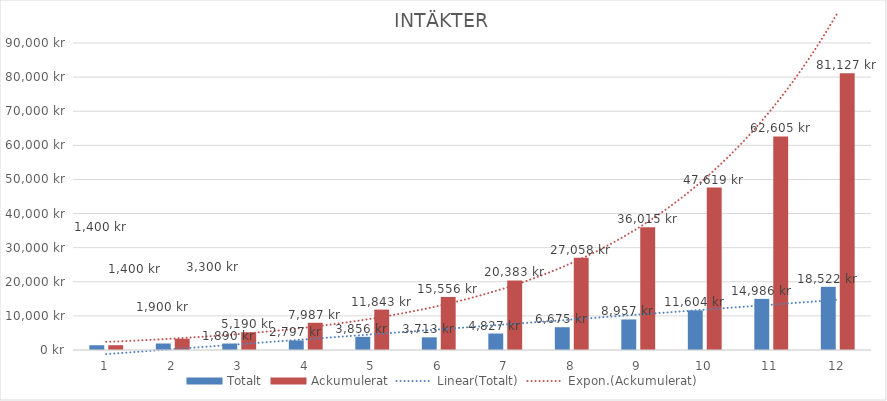
| Category | Totalt | Ackumulerat |
|---|---|---|
| 0 | 1400 | 1400 |
| 1 | 1900 | 3300 |
| 2 | 1890 | 5190 |
| 3 | 2797 | 7987 |
| 4 | 3856.1 | 11843.1 |
| 5 | 3712.93 | 15556.03 |
| 6 | 4826.809 | 20382.839 |
| 7 | 6674.852 | 27057.691 |
| 8 | 8957.307 | 36014.998 |
| 9 | 11604.499 | 47619.497 |
| 10 | 14985.849 | 62605.346 |
| 11 | 18521.604 | 81126.95 |